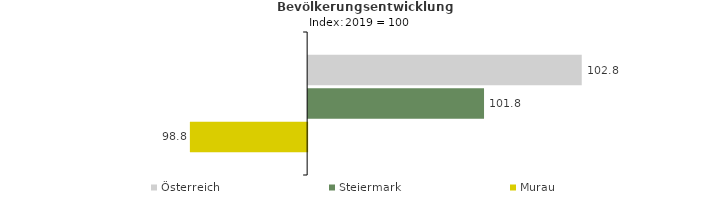
| Category | Österreich | Steiermark | Murau |
|---|---|---|---|
| 2023.0 | 102.8 | 101.8 | 98.8 |